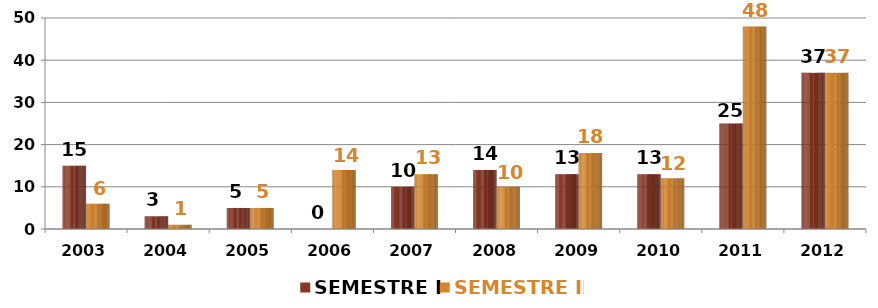
| Category | SEMESTRE I | SEMESTRE II |
|---|---|---|
| 2003.0 | 15 | 6 |
| 2004.0 | 3 | 1 |
| 2005.0 | 5 | 5 |
| 2006.0 | 0 | 14 |
| 2007.0 | 10 | 13 |
| 2008.0 | 14 | 10 |
| 2009.0 | 13 | 18 |
| 2010.0 | 13 | 12 |
| 2011.0 | 25 | 48 |
| 2012.0 | 37 | 37 |